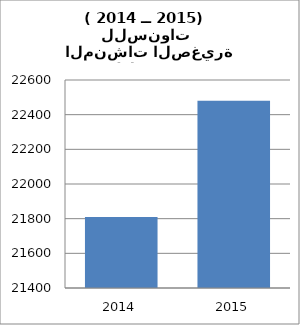
| Category | عـدد المنشات الصغيرة |
|---|---|
| 2014.0 | 21809 |
| 2015.0 | 22480 |